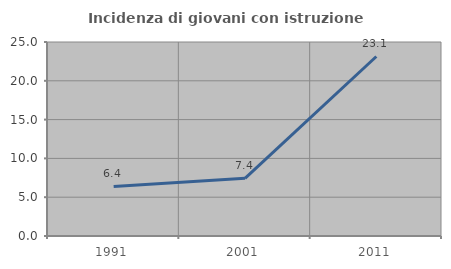
| Category | Incidenza di giovani con istruzione universitaria |
|---|---|
| 1991.0 | 6.383 |
| 2001.0 | 7.432 |
| 2011.0 | 23.134 |